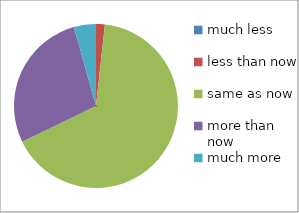
| Category | Series 0 |
|---|---|
| much less | 0 |
| less than now | 2 |
| same as now | 76 |
| more than now | 32 |
| much more | 5 |